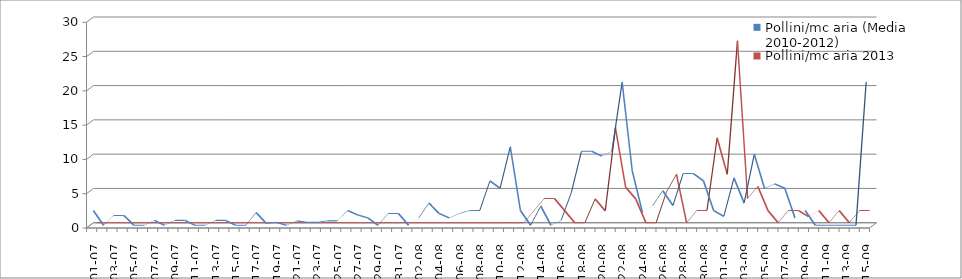
| Category | Pollini/mc aria (Media 2010-2012) | Pollini/mc aria 2013 |
|---|---|---|
| 01-07 | 2.16 | 0 |
| 02-07 | 0 | 0 |
| 03-07 | 1.44 | 0 |
| 04-07 | 1.44 | 0 |
| 05-07 | 0 | 0 |
| 06-07 | 0 | 0 |
| 07-07 | 0.72 | 0 |
| 08-07 | 0 | 0 |
| 09-07 | 0.72 | 0 |
| 10-07 | 0.72 | 0 |
| 11-07 | 0 | 0 |
| 12-07 | 0 | 0 |
| 13-07 | 0.72 | 0 |
| 14-07 | 0.72 | 0 |
| 15-07 | 0 | 0 |
| 16-07 | 0 | 0 |
| 17-07 | 1.873 | 0 |
| 18-07 | 0.287 | 0 |
| 19-07 | 0.43 | 0 |
| 20-07 | 0 | 0 |
| 21-07 | 0.65 | 0 |
| 22-07 | 0.43 | 0 |
| 23-07 | 0.43 | 0 |
| 24-07 | 0.65 | 0 |
| 25-07 | 0.65 | 0 |
| 26-07 | 2.16 | 0 |
| 27-07 | 1.51 | 0 |
| 28-07 | 1.08 | 0 |
| 29-07 | 0 | 0 |
| 30-07 | 1.73 | 0 |
| 31-07 | 1.73 | 0 |
| 01-08 | 0 | 0 |
| 02-08 | 1.08 | 0 |
| 03-08 | 3.24 | 0 |
| 04-08 | 1.73 | 0 |
| 05-08 | 1.08 | 0 |
| 06-08 | 1.73 | 0 |
| 07-08 | 2.16 | 0 |
| 08-08 | 2.16 | 0 |
| 09-08 | 6.48 | 0 |
| 10-08 | 5.4 | 0 |
| 11-08 | 11.45 | 0 |
| 12-08 | 2.16 | 0 |
| 13-08 | 0 | 1.77 |
| 14-08 | 2.81 | 3.54 |
| 15-08 | 0 | 3.54 |
| 16-08 | 0.72 | 1.77 |
| 17-08 | 4.753 | 0 |
| 18-08 | 10.803 | 0 |
| 19-08 | 10.803 | 3.46 |
| 20-08 | 10.083 | 1.73 |
| 21-08 | 10.8 | 13.83 |
| 22-08 | 20.883 | 5.19 |
| 23-08 | 7.92 | 3.46 |
| 24-08 | 1.873 | 0 |
| 25-08 | 2.88 | 0 |
| 26-08 | 5.04 | 4.42 |
| 27-08 | 2.88 | 7.07 |
| 28-08 | 7.56 | 0 |
| 29-08 | 7.56 | 1.77 |
| 30-08 | 6.48 | 1.77 |
| 31-08 | 2.16 | 12.37 |
| 01-09 | 1.3 | 7.07 |
| 02-09 | 6.91 | 26.52 |
| 03-09 | 3.24 | 3.54 |
| 04-09 | 10.37 | 5.3 |
| 05-09 | 5.4 | 1.77 |
| 06-09 | 6.05 | 0 |
| 07-09 | 5.4 | 1.77 |
| 08-09 | 1.08 | 1.77 |
| 09-09 | 2.16 | 0.88 |
| 10-09 | 0 | 1.77 |
| 11-09 | 0 | 0 |
| 12-09 | 0 | 1.77 |
| 13-09 | 0 | 0 |
| 14-09 | 0 | 1.77 |
| 15-09 | 20.883 | 1.77 |